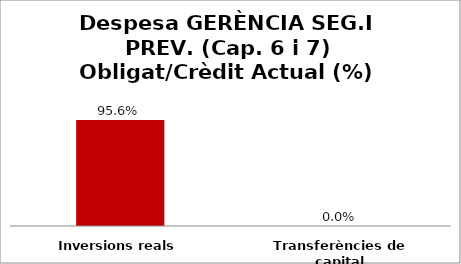
| Category | Series 0 |
|---|---|
| Inversions reals | 0.956 |
| Transferències de capital | 0 |